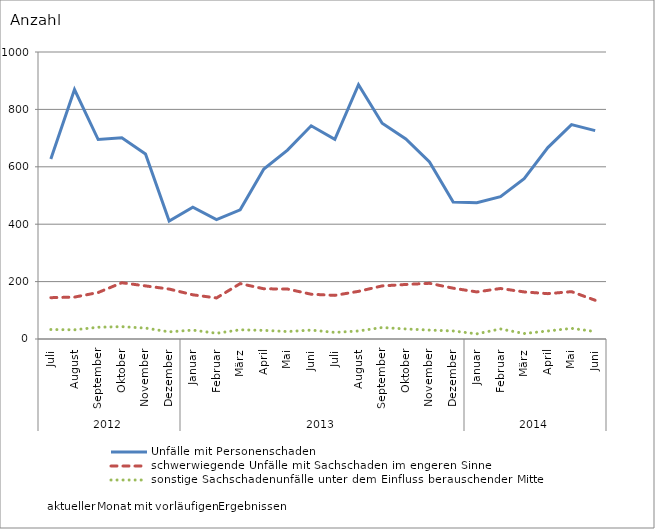
| Category | Unfälle mit Personenschaden | schwerwiegende Unfälle mit Sachschaden im engeren Sinne | sonstige Sachschadenunfälle unter dem Einfluss berauschender Mittel |
|---|---|---|---|
| 0 | 627 | 144 | 33 |
| 1 | 869 | 146 | 32 |
| 2 | 695 | 162 | 41 |
| 3 | 701 | 196 | 43 |
| 4 | 645 | 185 | 38 |
| 5 | 411 | 174 | 25 |
| 6 | 459 | 154 | 31 |
| 7 | 416 | 143 | 20 |
| 8 | 450 | 193 | 32 |
| 9 | 592 | 175 | 30 |
| 10 | 658 | 174 | 26 |
| 11 | 743 | 156 | 31 |
| 12 | 696 | 152 | 23 |
| 13 | 886 | 166 | 28 |
| 14 | 752 | 185 | 40 |
| 15 | 697 | 190 | 35 |
| 16 | 617 | 194 | 31 |
| 17 | 477 | 177 | 28 |
| 18 | 475 | 164 | 18 |
| 19 | 496 | 176 | 35 |
| 20 | 559 | 164 | 19 |
| 21 | 667 | 158 | 28 |
| 22 | 747 | 165 | 37 |
| 23 | 726 | 135 | 26 |